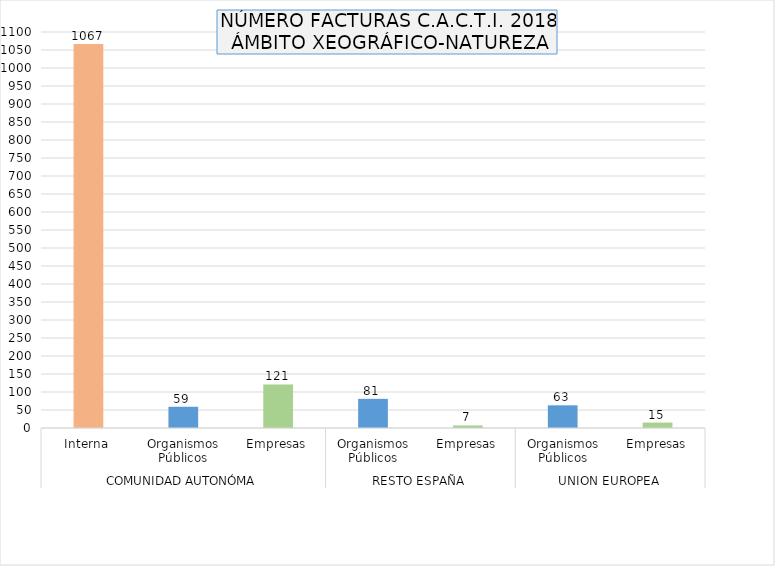
| Category | Series 0 |
|---|---|
| 0 | 1067 |
| 1 | 59 |
| 2 | 121 |
| 3 | 81 |
| 4 | 7 |
| 5 | 63 |
| 6 | 15 |